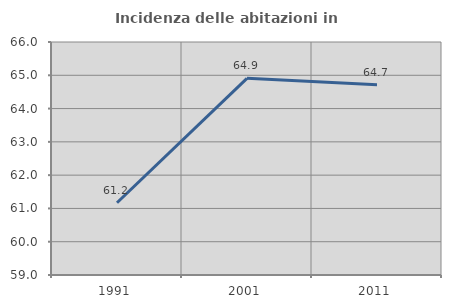
| Category | Incidenza delle abitazioni in proprietà  |
|---|---|
| 1991.0 | 61.169 |
| 2001.0 | 64.908 |
| 2011.0 | 64.719 |